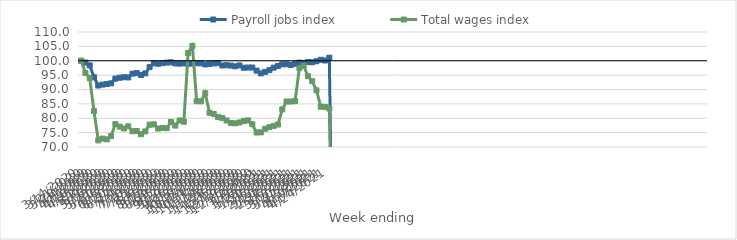
| Category | Payroll jobs index | Total wages index |
|---|---|---|
| 14/03/2020 | 100 | 100 |
| 21/03/2020 | 99.379 | 95.793 |
| 28/03/2020 | 98.376 | 93.97 |
| 04/04/2020 | 94.258 | 82.504 |
| 11/04/2020 | 91.382 | 72.296 |
| 18/04/2020 | 91.702 | 72.914 |
| 25/04/2020 | 91.928 | 72.654 |
| 02/05/2020 | 92.145 | 73.799 |
| 09/05/2020 | 93.778 | 77.982 |
| 16/05/2020 | 94.09 | 77.087 |
| 23/05/2020 | 94.272 | 76.444 |
| 30/05/2020 | 94.205 | 77.202 |
| 06/06/2020 | 95.521 | 75.479 |
| 13/06/2020 | 95.702 | 75.549 |
| 20/06/2020 | 95.056 | 74.436 |
| 27/06/2020 | 95.605 | 75.417 |
| 04/07/2020 | 97.774 | 77.758 |
| 11/07/2020 | 99.12 | 77.874 |
| 18/07/2020 | 98.951 | 76.416 |
| 25/07/2020 | 99.16 | 76.624 |
| 01/08/2020 | 99.347 | 76.552 |
| 08/08/2020 | 99.459 | 78.721 |
| 15/08/2020 | 99.066 | 77.439 |
| 22/08/2020 | 99.002 | 79.239 |
| 29/08/2020 | 99.084 | 78.782 |
| 05/09/2020 | 98.947 | 102.677 |
| 12/09/2020 | 99.028 | 105.124 |
| 19/09/2020 | 99.139 | 85.929 |
| 26/09/2020 | 99.104 | 85.889 |
| 03/10/2020 | 98.708 | 88.68 |
| 10/10/2020 | 98.895 | 81.896 |
| 17/10/2020 | 99.066 | 81.484 |
| 24/10/2020 | 99.167 | 80.399 |
| 31/10/2020 | 98.363 | 80.122 |
| 07/11/2020 | 98.446 | 79.232 |
| 14/11/2020 | 98.323 | 78.331 |
| 21/11/2020 | 98.056 | 78.232 |
| 28/11/2020 | 98.374 | 78.532 |
| 05/12/2020 | 97.57 | 79.034 |
| 12/12/2020 | 97.632 | 79.253 |
| 19/12/2020 | 97.65 | 77.923 |
| 26/12/2020 | 96.567 | 75.038 |
| 02/01/2021 | 95.599 | 75.099 |
| 09/01/2021 | 96.134 | 76.352 |
| 16/01/2021 | 96.748 | 76.902 |
| 23/01/2021 | 97.599 | 77.337 |
| 30/01/2021 | 98.172 | 77.82 |
| 06/02/2021 | 98.745 | 83.083 |
| 13/02/2021 | 98.782 | 85.819 |
| 20/02/2021 | 98.541 | 85.826 |
| 27/02/2021 | 98.933 | 85.949 |
| 06/03/2021 | 99.363 | 97.487 |
| 13/03/2021 | 99.182 | 98.262 |
| 20/03/2021 | 99.549 | 94.628 |
| 27/03/2021 | 99.461 | 92.886 |
| 03/04/2021 | 99.828 | 89.705 |
| 10/04/2021 | 100.339 | 84.026 |
| 17/04/2021 | 100.077 | 83.939 |
| 24/04/2021 | 101.055 | 83.389 |